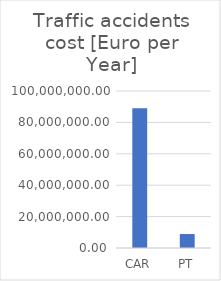
| Category | Series 0 |
|---|---|
| CAR | 88960000 |
| PT | 8896000 |